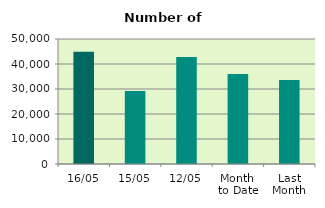
| Category | Series 0 |
|---|---|
| 16/05 | 44922 |
| 15/05 | 29244 |
| 12/05 | 42752 |
| Month 
to Date | 36005.636 |
| Last
Month | 33588.111 |